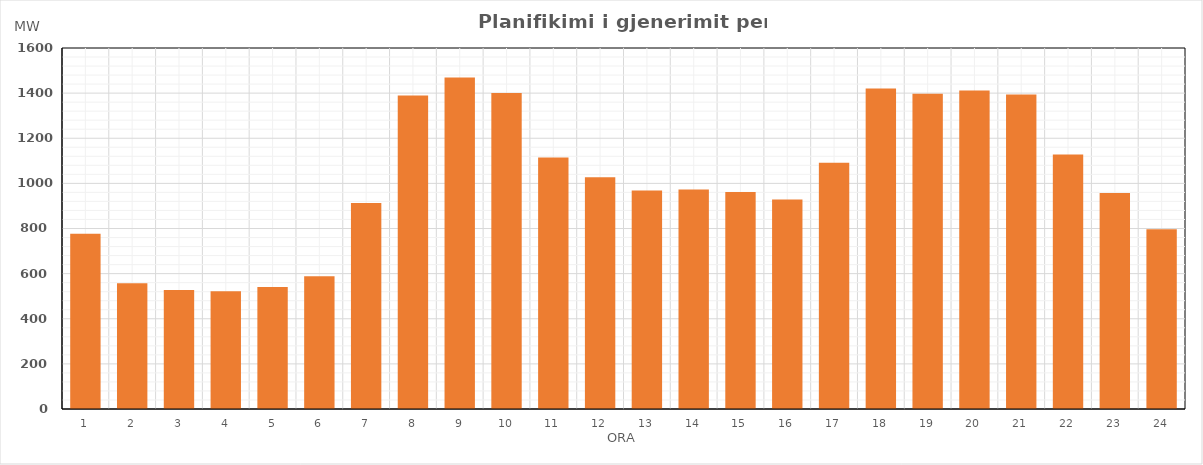
| Category | Max (MW) |
|---|---|
| 0 | 776.654 |
| 1 | 557.8 |
| 2 | 527.574 |
| 3 | 521.684 |
| 4 | 541.241 |
| 5 | 588.52 |
| 6 | 912.94 |
| 7 | 1389.577 |
| 8 | 1468.998 |
| 9 | 1400.518 |
| 10 | 1114.733 |
| 11 | 1026.632 |
| 12 | 967.889 |
| 13 | 972.524 |
| 14 | 961.692 |
| 15 | 928.848 |
| 16 | 1091.625 |
| 17 | 1421.001 |
| 18 | 1396.821 |
| 19 | 1411.194 |
| 20 | 1393.387 |
| 21 | 1128.413 |
| 22 | 957.507 |
| 23 | 796.502 |